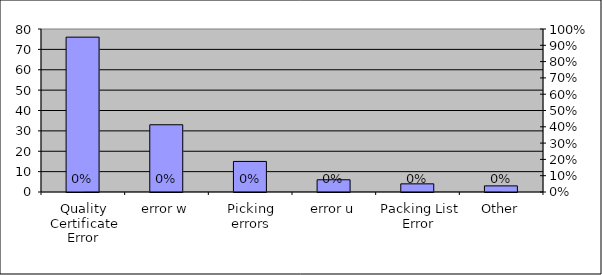
| Category | Series 0 |
|---|---|
| Quality Certificate Error | 76 |
| error w | 33 |
| Picking errors | 15 |
| error u | 6 |
| Packing List Error | 4 |
| Other | 3 |